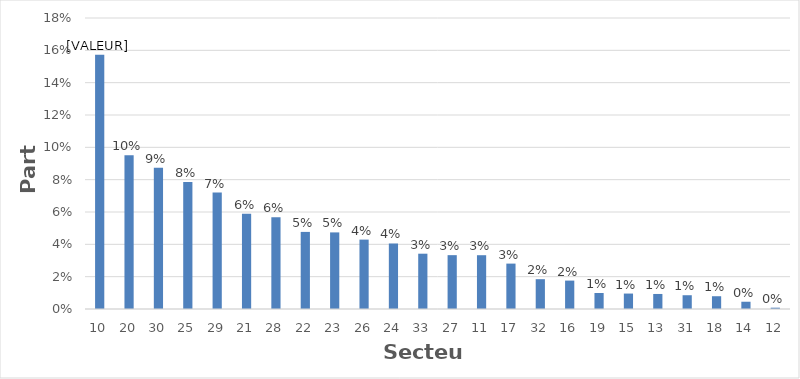
| Category | Series 0 |
|---|---|
| 10.0 | 0.157 |
| 20.0 | 0.095 |
| 30.0 | 0.087 |
| 25.0 | 0.079 |
| 29.0 | 0.072 |
| 21.0 | 0.059 |
| 28.0 | 0.057 |
| 22.0 | 0.048 |
| 23.0 | 0.047 |
| 26.0 | 0.043 |
| 24.0 | 0.041 |
| 33.0 | 0.034 |
| 27.0 | 0.033 |
| 11.0 | 0.033 |
| 17.0 | 0.028 |
| 32.0 | 0.018 |
| 16.0 | 0.018 |
| 19.0 | 0.01 |
| 15.0 | 0.01 |
| 13.0 | 0.009 |
| 31.0 | 0.009 |
| 18.0 | 0.008 |
| 14.0 | 0.004 |
| 12.0 | 0.001 |